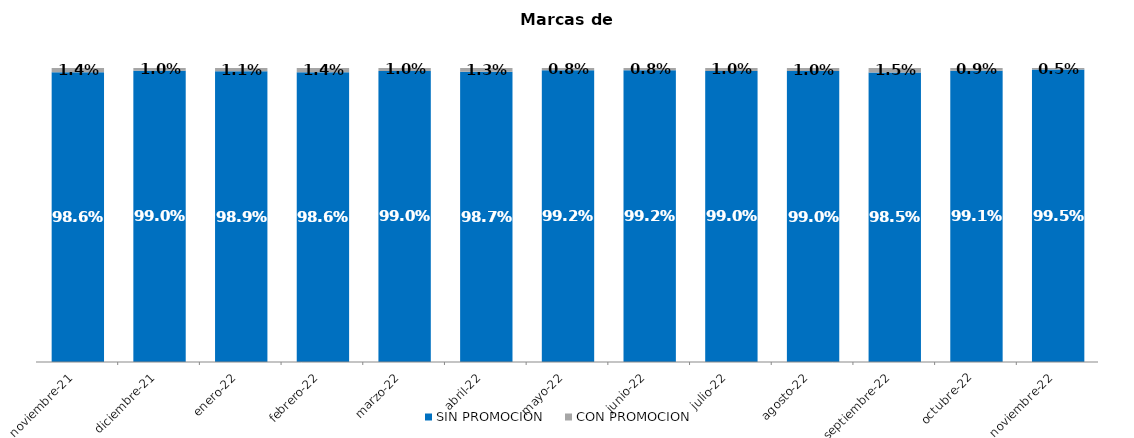
| Category | SIN PROMOCION   | CON PROMOCION   |
|---|---|---|
| 2021-11-01 | 0.986 | 0.014 |
| 2021-12-01 | 0.99 | 0.01 |
| 2022-01-01 | 0.989 | 0.011 |
| 2022-02-01 | 0.986 | 0.014 |
| 2022-03-01 | 0.99 | 0.01 |
| 2022-04-01 | 0.987 | 0.013 |
| 2022-05-01 | 0.992 | 0.008 |
| 2022-06-01 | 0.992 | 0.008 |
| 2022-07-01 | 0.99 | 0.01 |
| 2022-08-01 | 0.99 | 0.01 |
| 2022-09-01 | 0.985 | 0.015 |
| 2022-10-01 | 0.991 | 0.009 |
| 2022-11-01 | 0.995 | 0.005 |